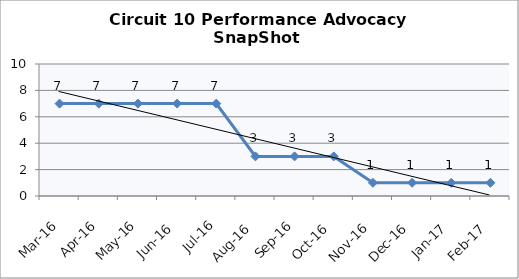
| Category | Circuit 10 |
|---|---|
| Mar-16 | 7 |
| Apr-16 | 7 |
| May-16 | 7 |
| Jun-16 | 7 |
| Jul-16 | 7 |
| Aug-16 | 3 |
| Sep-16 | 3 |
| Oct-16 | 3 |
| Nov-16 | 1 |
| Dec-16 | 1 |
| Jan-17 | 1 |
| Feb-17 | 1 |